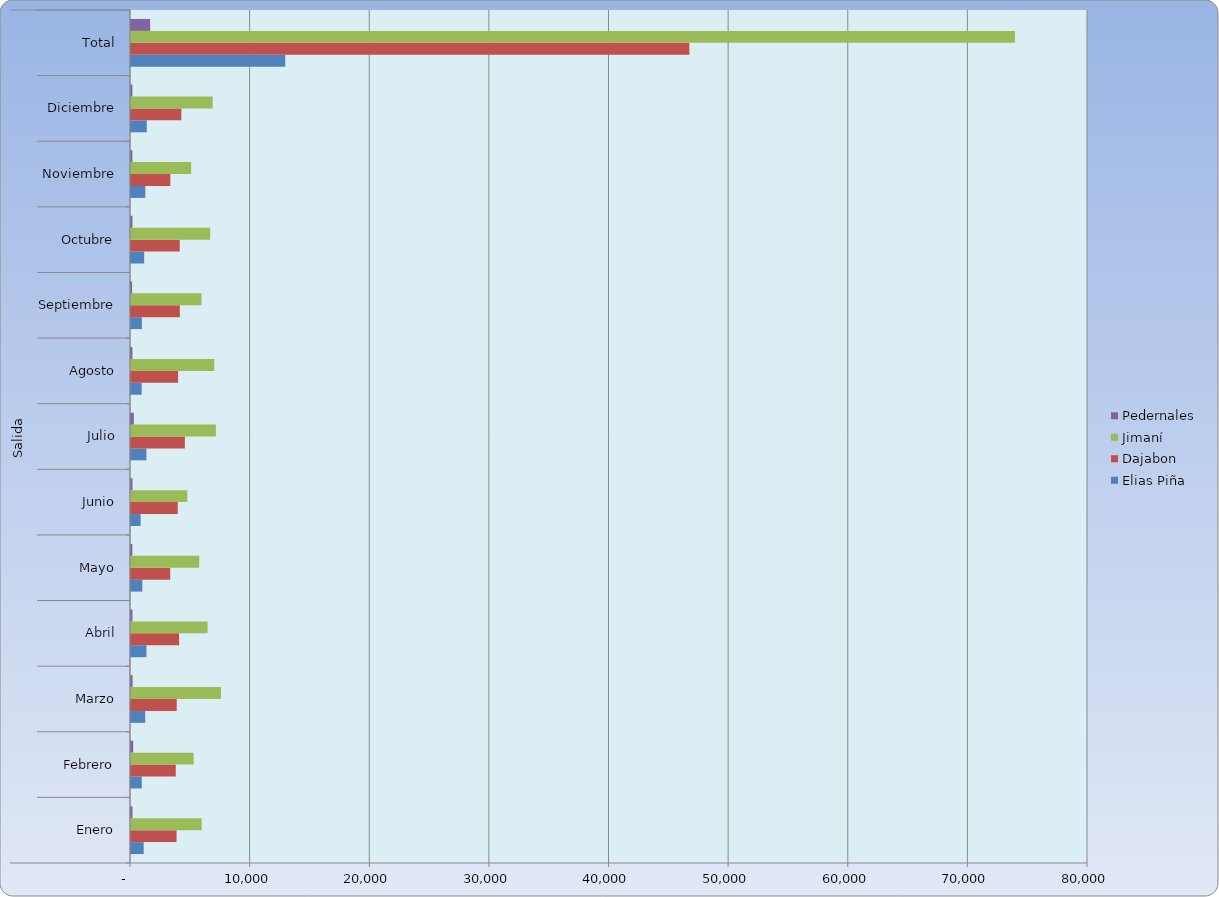
| Category | Elias Piña | Dajabon | Jimaní | Pedernales  |
|---|---|---|---|---|
| 0 | 1060 | 3809 | 5908 | 123 |
| 1 | 900 | 3742 | 5236 | 184 |
| 2 | 1188 | 3824 | 7520 | 135 |
| 3 | 1291 | 4020 | 6401 | 123 |
| 4 | 946 | 3278 | 5703 | 110 |
| 5 | 798 | 3908 | 4703 | 125 |
| 6 | 1288 | 4502 | 7097 | 235 |
| 7 | 894 | 3937 | 6959 | 119 |
| 8 | 909 | 4083 | 5888 | 90 |
| 9 | 1102 | 4075 | 6615 | 123 |
| 10 | 1198 | 3287 | 5032 | 115 |
| 11 | 1320 | 4211 | 6830 | 116 |
| 12 | 12894 | 46676 | 73892 | 1598 |